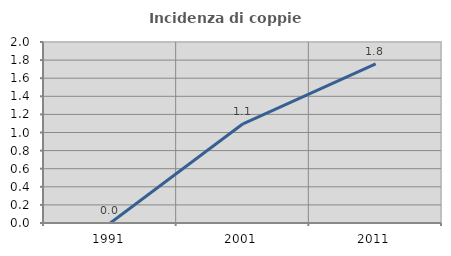
| Category | Incidenza di coppie miste |
|---|---|
| 1991.0 | 0 |
| 2001.0 | 1.096 |
| 2011.0 | 1.76 |